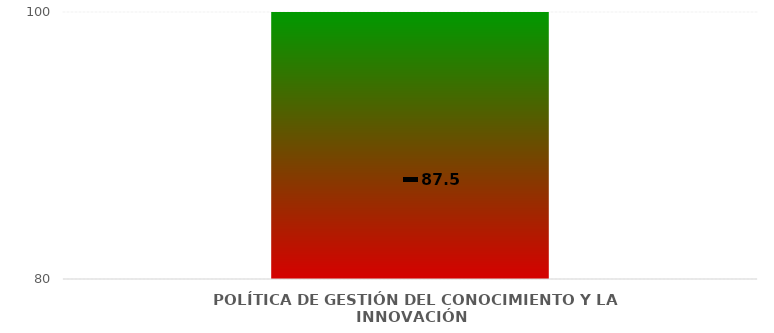
| Category | Niveles |
|---|---|
| POLÍTICA DE GESTIÓN DEL CONOCIMIENTO Y LA INNOVACIÓN | 100 |